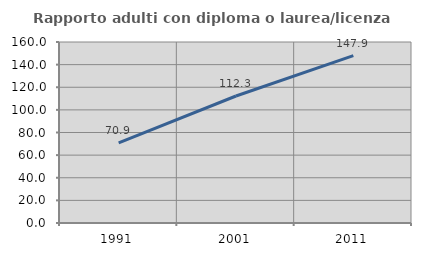
| Category | Rapporto adulti con diploma o laurea/licenza media  |
|---|---|
| 1991.0 | 70.896 |
| 2001.0 | 112.28 |
| 2011.0 | 147.894 |